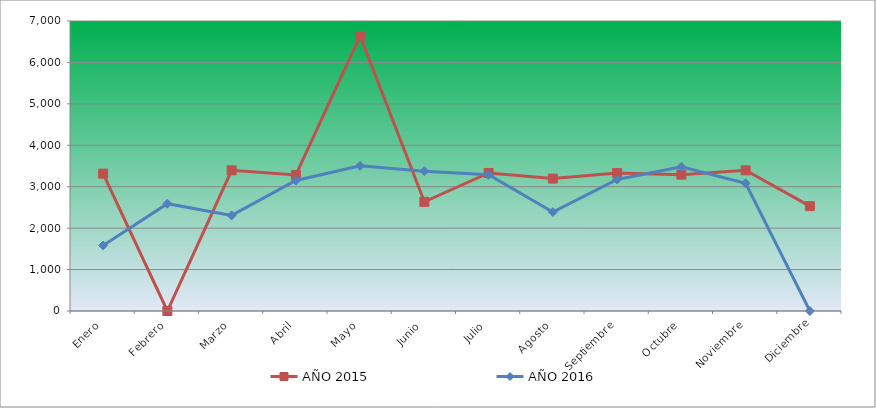
| Category | AÑO 2015 | AÑO 2016 |
|---|---|---|
| Enero | 3315.798 | 1582.771 |
| Febrero | 0 | 2590.725 |
| Marzo | 3395.89 | 2307.364 |
| Abril | 3283.761 | 3149.35 |
| Mayo | 6639.606 | 3505.574 |
| Junio | 2635.018 | 3376.038 |
| Julio | 3331.817 | 3286.982 |
| Agosto | 3195.661 | 2388.324 |
| Septiembre | 3331.817 | 3173.638 |
| Octubre | 3291.771 | 3481.286 |
| Noviembre | 3395.89 | 3084.582 |
| Diciembre | 2530.899 | 0 |